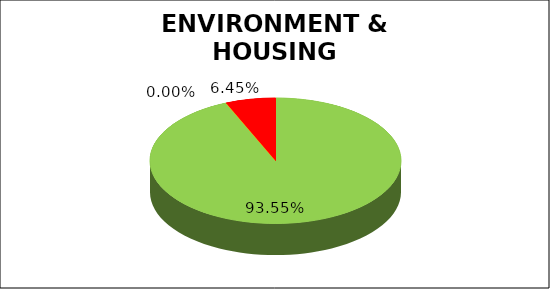
| Category | Q4 |
|---|---|
| Green | 0.935 |
| Amber | 0 |
| Red | 0.065 |